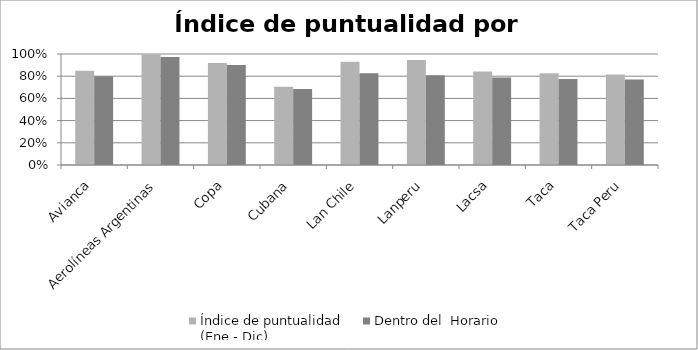
| Category | Índice de puntualidad
(Ene - Dic) | Dentro del  Horario |
|---|---|---|
| Avianca | 0.85 | 0.801 |
| Aerolíneas Argentinas | 0.997 | 0.972 |
| Copa | 0.92 | 0.9 |
| Cubana | 0.704 | 0.685 |
| Lan Chile | 0.93 | 0.827 |
| Lanperu | 0.946 | 0.809 |
| Lacsa | 0.842 | 0.787 |
| Taca | 0.826 | 0.774 |
| Taca Peru | 0.814 | 0.769 |